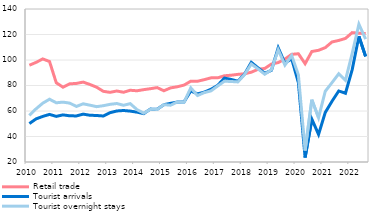
| Category | Retail trade  | Tourist arrivals  | Tourist overnight stays  |
|---|---|---|---|
| 2010 | 95.895 | 50.141 | 56.467 |
| II | 98.147 | 53.821 | 61.73 |
| III | 100.837 | 55.77 | 66.167 |
| IV | 98.786 | 57.332 | 69.238 |
| 2011 | 82.145 | 55.782 | 66.448 |
| II | 78.661 | 56.954 | 66.961 |
| III | 81.305 | 56.228 | 66.177 |
| IV | 81.637 | 56.137 | 63.576 |
| 2012 | 82.663 | 57.544 | 65.644 |
| II | 80.817 | 56.673 | 64.579 |
| III | 78.671 | 56.472 | 63.406 |
| IV | 75.427 | 56.08 | 64.172 |
| 2013 | 74.626 | 58.687 | 65.239 |
| II | 75.686 | 60.01 | 65.865 |
| III | 74.704 | 60.4 | 64.492 |
| IV | 76.268 | 59.905 | 65.774 |
| 2014 | 75.864 | 59.106 | 61.099 |
| II | 76.74 | 57.945 | 58.316 |
| III | 77.489 | 61.487 | 61.299 |
| IV | 78.349 | 61.369 | 61.264 |
| 2015 | 75.87 | 64.948 | 65.004 |
| II | 78.114 | 66.012 | 64.55 |
| III | 79.02 | 67.016 | 67.103 |
| IV | 80.315 | 67.14 | 66.858 |
| 2016 | 83.391 | 75.721 | 78.128 |
| II | 83.336 | 73.435 | 72.137 |
| III | 84.578 | 74.794 | 74.423 |
| IV | 85.983 | 77.028 | 75.763 |
| 2017 | 86.01 | 80.067 | 79.607 |
| II | 87.628 | 85.835 | 83.345 |
| III | 88.067 | 84.745 | 83.149 |
| IV | 88.732 | 83.377 | 82.8 |
| 2018 | 89.196 | 88.985 | 88.645 |
| II | 90.439 | 98.147 | 96.869 |
| III | 92.692 | 93.844 | 92.992 |
| IV | 93.38 | 89.608 | 88.834 |
| 2019 | 96.868 | 91.949 | 92.35 |
| II | 97.958 | 109.565 | 108.077 |
| III | 100.754 | 97.487 | 96.032 |
| IV | 104.421 | 100.999 | 103.541 |
| 2020 | 104.921 | 82.257 | 88.297 |
| II | 97.107 | 23.453 | 28.985 |
| III | 106.667 | 53.571 | 68.878 |
| IV | 107.611 | 41.643 | 54.778 |
| 2021 | 109.697 | 58.917 | 75.505 |
| II | 114.152 | 67.647 | 82.227 |
| III | 115.337 | 75.732 | 89.22 |
| IV | 116.914 | 73.904 | 84.003 |
| 2022 | 121.475 | 92.434 | 105.151 |
| II | 121.026 | 118.576 | 128.146 |
| III | 120.774 | 102.792 | 116.383 |